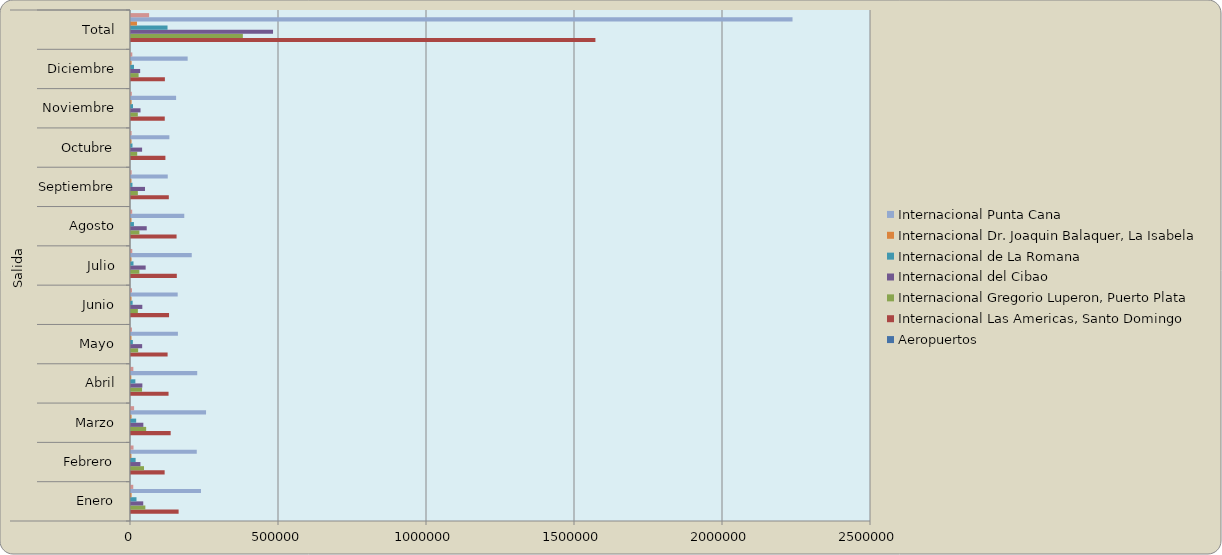
| Category | Aeropuertos | Internacional Las Americas, Santo Domingo | Internacional Gregorio Luperon, Puerto Plata  | Internacional del Cibao | Internacional de La Romana  | Internacional Dr. Joaquin Balaquer, La Isabela | Internacional Punta Cana  | Internacional Profesor Juan Bosch, El Catey (Samana) |
|---|---|---|---|---|---|---|---|---|
| 0 |  | 160844 | 48511 | 41367 | 18580 | 1995 | 236386 | 7651 |
| 1 |  | 113653 | 44007 | 31856 | 15637 | 1408 | 222178 | 8539 |
| 2 |  | 134017 | 51223 | 41713 | 17501 | 1862 | 253548 | 10471 |
| 3 |  | 126873 | 37344 | 38369 | 14762 | 1022 | 223687 | 7959 |
| 4 |  | 123674 | 24108 | 37696 | 6227 | 1611 | 158478 | 3219 |
| 5 |  | 128558 | 23200 | 38251 | 5532 | 1779 | 157767 | 3363 |
| 6 |  | 154762 | 28245 | 49538 | 8446 | 1709 | 205262 | 4364 |
| 7 |  | 153968 | 28380 | 53170 | 9899 | 1661 | 179966 | 4052 |
| 8 |  | 127789 | 23177 | 47253 | 4915 | 1527 | 124146 | 2249 |
| 9 |  | 116228 | 20970 | 37497 | 4978 | 1686 | 129658 | 2077 |
| 10 |  | 114074 | 23052 | 32148 | 6854 | 1939 | 152395 | 2772 |
| 11 |  | 114495 | 25706 | 30955 | 10078 | 1977 | 191410 | 4463 |
| 12 |  | 1568935 | 377923 | 479813 | 123409 | 20176 | 2234881 | 61179 |